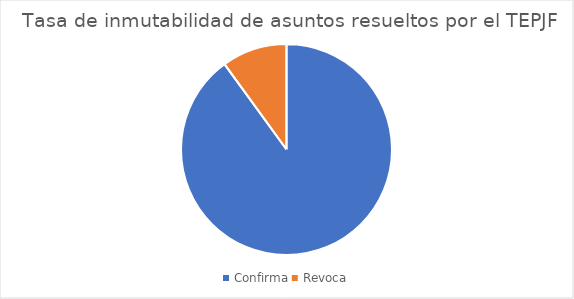
| Category | Tasa de inmutabilidad de asuntos resueltos por el TEPJF |
|---|---|
| Confirma | 9 |
| Revoca | 1 |